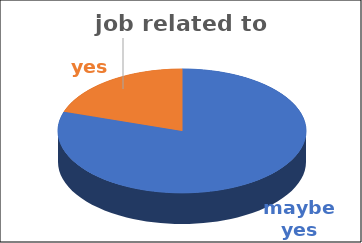
| Category | job related to studies | Series 1 | Series 2 | Series 3 | Series 4 |
|---|---|---|---|---|---|
| maybe yes | 0.8 |  |  |  |  |
| yes | 0.2 |  |  |  |  |